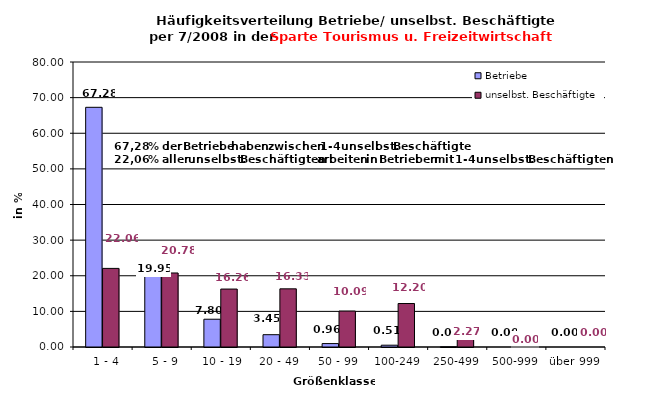
| Category | Betriebe | unselbst. Beschäftigte |
|---|---|---|
|   1 - 4 | 67.282 | 22.064 |
|   5 - 9 | 19.949 | 20.777 |
|  10 - 19 | 7.795 | 16.265 |
| 20 - 49 | 3.455 | 16.329 |
| 50 - 99 | 0.959 | 10.092 |
| 100-249 | 0.506 | 12.204 |
| 250-499 | 0.054 | 2.269 |
| 500-999 | 0 | 0 |
| über 999 | 0 | 0 |